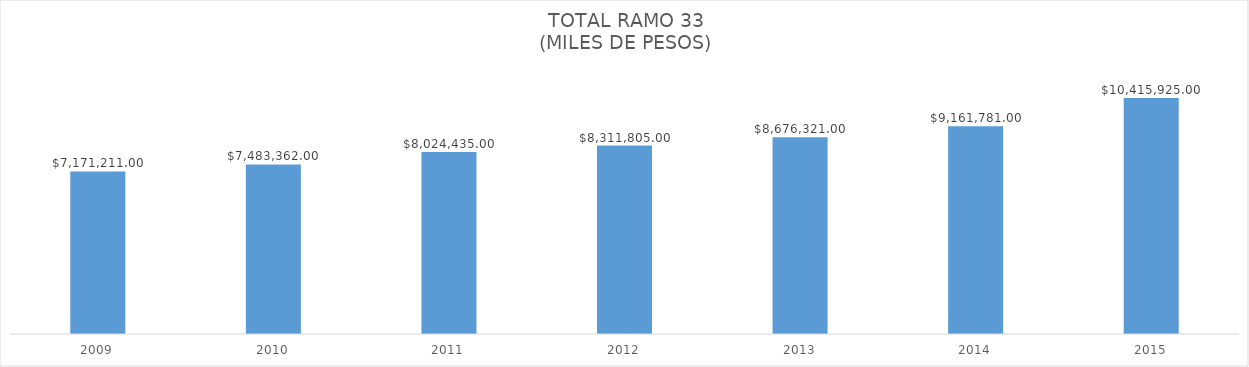
| Category | TOTAL RAMO 33 |
|---|---|
| 2009.0 | 7171211 |
| 2010.0 | 7483362 |
| 2011.0 | 8024435 |
| 2012.0 | 8311805 |
| 2013.0 | 8676321 |
| 2014.0 | 9161781 |
| 2015.0 | 10415925 |